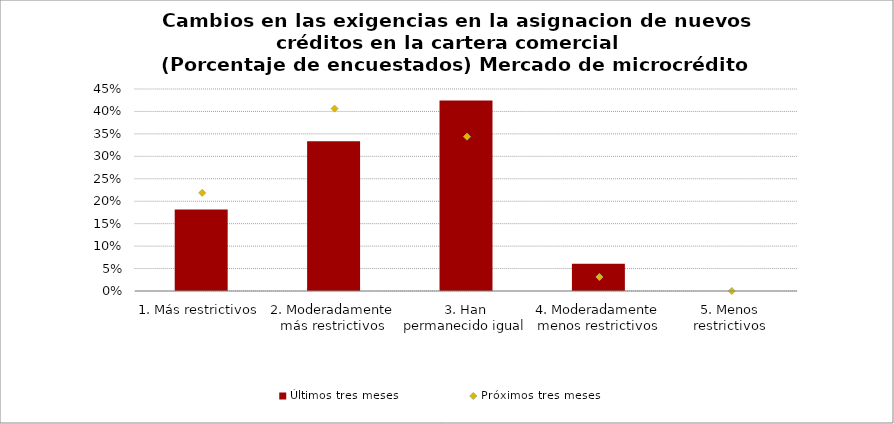
| Category | Últimos tres meses |
|---|---|
| 1. Más restrictivos | 0.182 |
| 2. Moderadamente más restrictivos | 0.333 |
| 3. Han permanecido igual | 0.424 |
| 4. Moderadamente menos restrictivos | 0.061 |
| 5. Menos restrictivos | 0 |